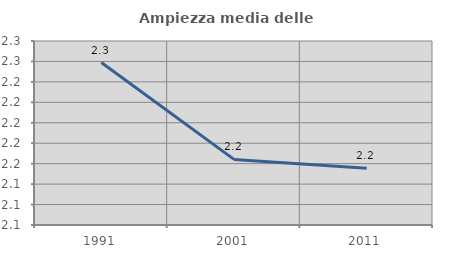
| Category | Ampiezza media delle famiglie |
|---|---|
| 1991.0 | 2.259 |
| 2001.0 | 2.164 |
| 2011.0 | 2.155 |